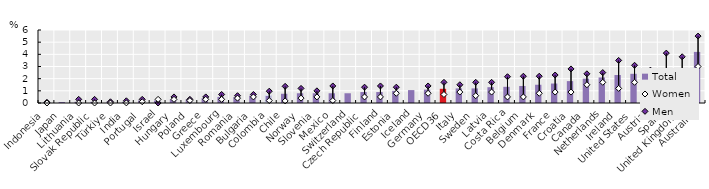
| Category | Total |
|---|---|
| Indonesia | 0.03 |
| Japan | 0.08 |
| Lithuania | 0.1 |
| Slovak Republic | 0.1 |
| Türkiye | 0.1 |
| India | 0.1 |
| Portugal | 0.2 |
| Israel | 0.2 |
| Hungary | 0.3 |
| Poland | 0.3 |
| Greece | 0.4 |
| Luxembourg | 0.5 |
| Romania | 0.5 |
| Bulgaria | 0.6 |
| Colombia | 0.62 |
| Chile | 0.76 |
| Norway | 0.8 |
| Slovenia | 0.8 |
| Mexico | 0.8 |
| Switzerland | 0.8 |
| Czech Republic | 0.9 |
| Finland | 0.9 |
| Estonia | 1 |
| Iceland | 1.06 |
| Germany | 1.1 |
| OECD36 | 1.168 |
| Italy | 1.2 |
| Sweden | 1.2 |
| Latvia | 1.3 |
| Costa Rica | 1.33 |
| Belgium | 1.4 |
| Denmark | 1.5 |
| France | 1.6 |
| Croatia | 1.8 |
| Canada | 2 |
| Netherlands | 2.1 |
| Ireland | 2.3 |
| United States | 2.4 |
| Austria | 2.5 |
| Spain | 2.5 |
| United Kingdom | 2.7 |
| Australia | 4.2 |